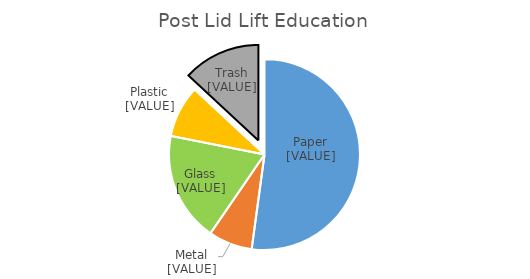
| Category | Series 0 |
|---|---|
| Paper | 0.521 |
| Metals | 0.074 |
| Glass | 0.186 |
| Plastic | 0.088 |
| Trash  | 0.131 |